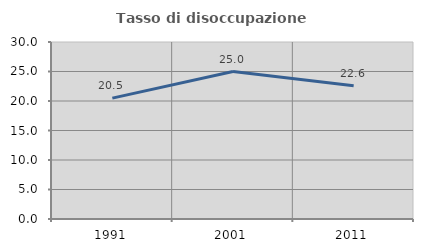
| Category | Tasso di disoccupazione giovanile  |
|---|---|
| 1991.0 | 20.482 |
| 2001.0 | 25 |
| 2011.0 | 22.581 |